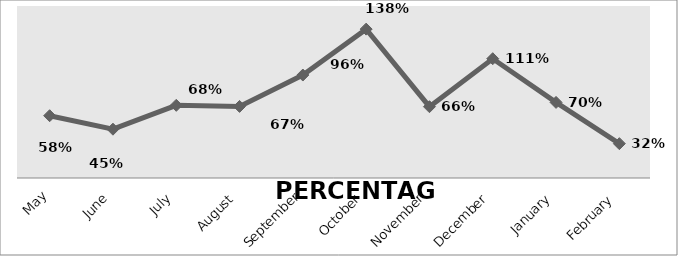
| Category | PERCENTAGE |
|---|---|
| May | 0.579 |
| June | 0.454 |
| July | 0.676 |
| August | 0.666 |
| September | 0.958 |
| October | 1.385 |
| November | 0.663 |
| December | 1.11 |
| January | 0.703 |
| February | 0.32 |